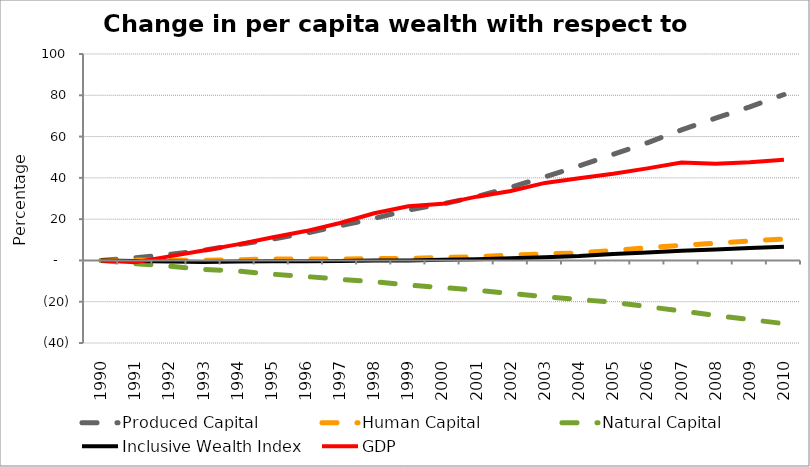
| Category | Produced Capital  | Human Capital | Natural Capital | Inclusive Wealth Index | GDP |
|---|---|---|---|---|---|
| 1990.0 | 0 | 0 | 0 | 0 | 0 |
| 1991.0 | 1.276 | 0.158 | -1.553 | -0.286 | -0.848 |
| 1992.0 | 2.949 | 0.081 | -2.777 | -0.5 | 1.974 |
| 1993.0 | 4.926 | 0.042 | -4.305 | -0.759 | 4.835 |
| 1994.0 | 7.578 | 0.249 | -5.159 | -0.547 | 7.782 |
| 1995.0 | 10.241 | 0.748 | -6.633 | -0.419 | 11.07 |
| 1996.0 | 13.235 | 0.707 | -7.788 | -0.381 | 14.214 |
| 1997.0 | 16.744 | 0.7 | -9.152 | -0.319 | 18.126 |
| 1998.0 | 20.372 | 0.889 | -10.325 | -0.076 | 22.83 |
| 1999.0 | 24.439 | 0.874 | -11.96 | -0.028 | 26.249 |
| 2000.0 | 27.337 | 1.432 | -13.127 | 0.277 | 27.408 |
| 2001.0 | 30.857 | 1.845 | -14.403 | 0.572 | 30.894 |
| 2002.0 | 35.454 | 2.557 | -16.019 | 1.058 | 33.648 |
| 2003.0 | 40.502 | 3.209 | -17.605 | 1.598 | 37.546 |
| 2004.0 | 45.741 | 3.632 | -18.957 | 2.146 | 39.758 |
| 2005.0 | 51.39 | 4.839 | -20.263 | 3.149 | 41.949 |
| 2006.0 | 56.978 | 6.099 | -22.378 | 3.873 | 44.593 |
| 2007.0 | 63.231 | 7.317 | -24.528 | 4.671 | 47.463 |
| 2008.0 | 68.889 | 8.33 | -26.62 | 5.297 | 46.86 |
| 2009.0 | 74.421 | 9.417 | -28.635 | 5.966 | 47.537 |
| 2010.0 | 80.39 | 10.412 | -30.597 | 6.68 | 48.719 |